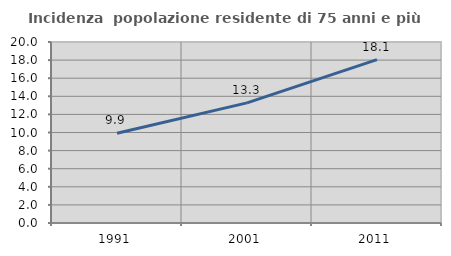
| Category | Incidenza  popolazione residente di 75 anni e più |
|---|---|
| 1991.0 | 9.924 |
| 2001.0 | 13.272 |
| 2011.0 | 18.056 |